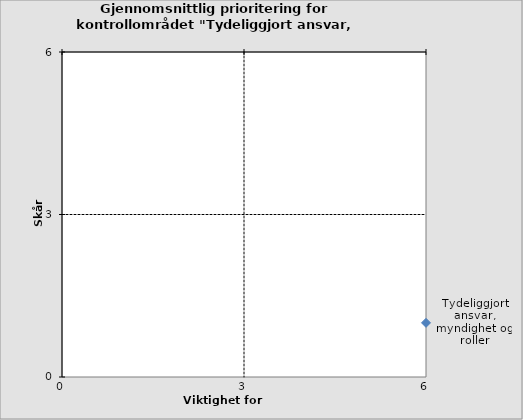
| Category | Tydeliggjort ansvar, myndighet og roller |
|---|---|
| 6.0 | 1 |